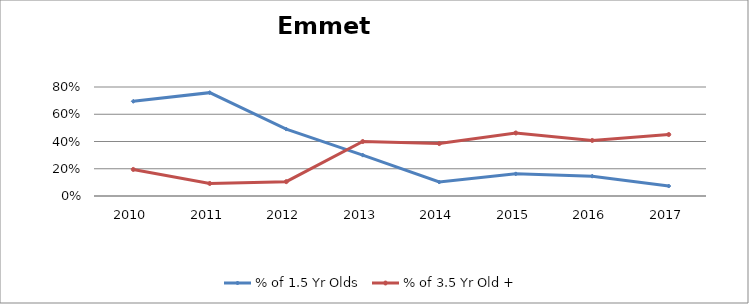
| Category | % of 1.5 Yr Olds | % of 3.5 Yr Old + |
|---|---|---|
| 2010.0 | 0.695 | 0.195 |
| 2011.0 | 0.759 | 0.092 |
| 2012.0 | 0.491 | 0.105 |
| 2013.0 | 0.3 | 0.4 |
| 2014.0 | 0.103 | 0.385 |
| 2015.0 | 0.162 | 0.462 |
| 2016.0 | 0.146 | 0.408 |
| 2017.0 | 0.073 | 0.451 |